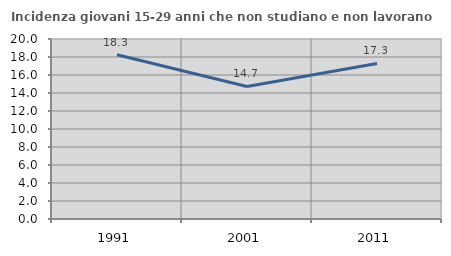
| Category | Incidenza giovani 15-29 anni che non studiano e non lavorano  |
|---|---|
| 1991.0 | 18.253 |
| 2001.0 | 14.731 |
| 2011.0 | 17.286 |